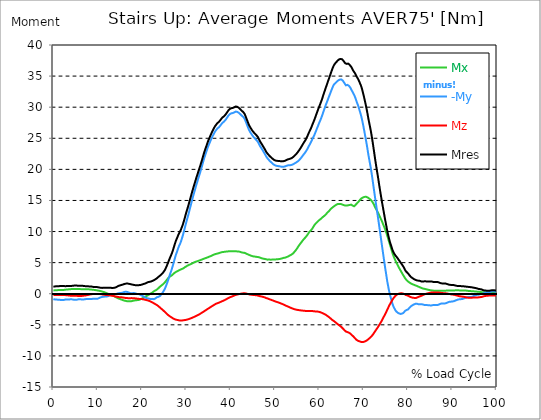
| Category |  Mx |  -My |  Mz |  Mres |
|---|---|---|---|---|
| 0.0 | 0.534 | -0.867 | -0.219 | 1.124 |
| 0.16678370786516855 | 0.534 | -0.886 | -0.219 | 1.153 |
| 0.3335674157303371 | 0.543 | -0.915 | -0.21 | 1.172 |
| 0.5003511235955057 | 0.553 | -0.924 | -0.2 | 1.191 |
| 0.6671348314606742 | 0.562 | -0.943 | -0.2 | 1.2 |
| 0.8339185393258427 | 0.572 | -0.953 | -0.2 | 1.21 |
| 1.0007022471910114 | 0.581 | -0.953 | -0.2 | 1.21 |
| 1.1674859550561796 | 0.591 | -0.953 | -0.21 | 1.22 |
| 1.3342696629213484 | 0.591 | -0.972 | -0.21 | 1.22 |
| 1.5010533707865168 | 0.591 | -0.991 | -0.219 | 1.239 |
| 1.6678370786516854 | 0.591 | -1 | -0.219 | 1.248 |
| 1.8346207865168538 | 0.591 | -1.019 | -0.219 | 1.258 |
| 2.001404494382023 | 0.6 | -1.019 | -0.21 | 1.258 |
| 2.1681882022471908 | 0.6 | -1.019 | -0.2 | 1.258 |
| 2.334971910112359 | 0.61 | -1.01 | -0.2 | 1.248 |
| 2.501755617977528 | 0.629 | -0.981 | -0.21 | 1.229 |
| 2.668539325842697 | 0.648 | -0.943 | -0.219 | 1.21 |
| 2.8353230337078656 | 0.657 | -0.924 | -0.238 | 1.21 |
| 3.0021067415730336 | 0.676 | -0.943 | -0.248 | 1.229 |
| 3.168890449438202 | 0.686 | -0.953 | -0.257 | 1.248 |
| 3.335674157303371 | 0.696 | -0.943 | -0.267 | 1.248 |
| 3.502457865168539 | 0.715 | -0.924 | -0.276 | 1.248 |
| 3.6692415730337076 | 0.724 | -0.915 | -0.295 | 1.248 |
| 3.8360252808988764 | 0.734 | -0.896 | -0.314 | 1.239 |
| 4.002808988764046 | 0.743 | -0.886 | -0.333 | 1.248 |
| 4.169592696629214 | 0.753 | -0.896 | -0.343 | 1.258 |
| 4.3363764044943816 | 0.753 | -0.924 | -0.343 | 1.277 |
| 4.50316011235955 | 0.762 | -0.953 | -0.343 | 1.296 |
| 4.669943820224718 | 0.762 | -0.972 | -0.343 | 1.305 |
| 4.836727528089888 | 0.753 | -0.981 | -0.343 | 1.315 |
| 5.003511235955056 | 0.762 | -0.981 | -0.333 | 1.315 |
| 5.170294943820225 | 0.772 | -0.972 | -0.333 | 1.315 |
| 5.337078651685394 | 0.772 | -0.953 | -0.343 | 1.305 |
| 5.5038623595505625 | 0.772 | -0.924 | -0.353 | 1.286 |
| 5.670646067415731 | 0.762 | -0.896 | -0.362 | 1.277 |
| 5.837429775280899 | 0.753 | -0.886 | -0.372 | 1.267 |
| 6.004213483146067 | 0.743 | -0.886 | -0.372 | 1.267 |
| 6.170997191011236 | 0.743 | -0.905 | -0.372 | 1.277 |
| 6.329002808988764 | 0.734 | -0.915 | -0.362 | 1.277 |
| 6.495786516853932 | 0.734 | -0.924 | -0.353 | 1.277 |
| 6.662570224719101 | 0.734 | -0.924 | -0.333 | 1.267 |
| 6.82935393258427 | 0.724 | -0.915 | -0.314 | 1.258 |
| 6.9961376404494375 | 0.724 | -0.905 | -0.295 | 1.239 |
| 7.162921348314607 | 0.724 | -0.877 | -0.276 | 1.22 |
| 7.329705056179775 | 0.734 | -0.857 | -0.267 | 1.2 |
| 7.496488764044945 | 0.734 | -0.848 | -0.248 | 1.2 |
| 7.663272471910113 | 0.734 | -0.857 | -0.219 | 1.2 |
| 7.830056179775281 | 0.724 | -0.857 | -0.2 | 1.191 |
| 7.996839887640449 | 0.705 | -0.857 | -0.171 | 1.181 |
| 8.16362359550562 | 0.696 | -0.857 | -0.133 | 1.162 |
| 8.330407303370787 | 0.686 | -0.867 | -0.105 | 1.153 |
| 8.497191011235955 | 0.676 | -0.867 | -0.086 | 1.153 |
| 8.663974719101123 | 0.657 | -0.857 | -0.067 | 1.143 |
| 8.830758426966291 | 0.648 | -0.81 | -0.067 | 1.124 |
| 8.99754213483146 | 0.629 | -0.791 | -0.057 | 1.096 |
| 9.16432584269663 | 0.619 | -0.781 | -0.057 | 1.086 |
| 9.331109550561798 | 0.61 | -0.791 | -0.057 | 1.086 |
| 9.497893258426966 | 0.591 | -0.81 | -0.057 | 1.086 |
| 9.664676966292134 | 0.562 | -0.81 | -0.048 | 1.077 |
| 9.831460674157304 | 0.543 | -0.81 | -0.048 | 1.077 |
| 9.998244382022472 | 0.524 | -0.8 | -0.038 | 1.058 |
| 10.16502808988764 | 0.495 | -0.743 | -0.038 | 1.029 |
| 10.331811797752808 | 0.476 | -0.686 | -0.048 | 1 |
| 10.498595505617978 | 0.448 | -0.629 | -0.057 | 0.981 |
| 10.665379213483147 | 0.419 | -0.581 | -0.067 | 0.962 |
| 10.832162921348315 | 0.381 | -0.543 | -0.086 | 0.943 |
| 10.998946629213483 | 0.353 | -0.514 | -0.105 | 0.934 |
| 11.165730337078653 | 0.314 | -0.486 | -0.124 | 0.953 |
| 11.33251404494382 | 0.276 | -0.476 | -0.143 | 0.972 |
| 11.49929775280899 | 0.229 | -0.467 | -0.162 | 0.981 |
| 11.666081460674157 | 0.2 | -0.457 | -0.181 | 0.962 |
| 11.832865168539326 | 0.143 | -0.457 | -0.191 | 0.962 |
| 11.999648876404493 | 0.095 | -0.448 | -0.21 | 0.972 |
| 12.166432584269662 | 0.038 | -0.429 | -0.219 | 0.972 |
| 12.333216292134832 | -0.01 | -0.391 | -0.229 | 0.962 |
| 12.5 | -0.048 | -0.333 | -0.238 | 0.953 |
| 12.66678370786517 | -0.095 | -0.276 | -0.248 | 0.962 |
| 12.833567415730336 | -0.133 | -0.21 | -0.267 | 0.972 |
| 13.000351123595506 | -0.181 | -0.162 | -0.295 | 0.943 |
| 13.167134831460674 | -0.21 | -0.133 | -0.314 | 0.924 |
| 13.333918539325843 | -0.267 | -0.105 | -0.333 | 0.934 |
| 13.500702247191011 | -0.324 | -0.095 | -0.353 | 0.934 |
| 13.667485955056181 | -0.391 | -0.067 | -0.381 | 0.943 |
| 13.834269662921349 | -0.457 | -0.048 | -0.41 | 0.953 |
| 14.001053370786519 | -0.514 | -0.048 | -0.438 | 1 |
| 14.167837078651687 | -0.581 | -0.029 | -0.457 | 1.058 |
| 14.334620786516853 | -0.638 | -0.01 | -0.486 | 1.115 |
| 14.501404494382026 | -0.696 | 0.029 | -0.505 | 1.181 |
| 14.668188202247192 | -0.753 | 0.086 | -0.534 | 1.258 |
| 14.834971910112362 | -0.791 | 0.105 | -0.553 | 1.296 |
| 15.001755617977528 | -0.838 | 0.105 | -0.562 | 1.334 |
| 15.168539325842698 | -0.877 | 0.114 | -0.572 | 1.362 |
| 15.335323033707864 | -0.934 | 0.124 | -0.572 | 1.401 |
| 15.502106741573034 | -0.981 | 0.152 | -0.581 | 1.439 |
| 15.6688904494382 | -1.019 | 0.191 | -0.6 | 1.477 |
| 15.83567415730337 | -1.067 | 0.248 | -0.629 | 1.524 |
| 16.00245786516854 | -1.105 | 0.286 | -0.648 | 1.562 |
| 16.16924157303371 | -1.134 | 0.314 | -0.667 | 1.601 |
| 16.336025280898877 | -1.153 | 0.314 | -0.686 | 1.62 |
| 16.502808988764045 | -1.191 | 0.314 | -0.696 | 1.648 |
| 16.669592696629216 | -1.21 | 0.286 | -0.705 | 1.648 |
| 16.83637640449438 | -1.22 | 0.238 | -0.715 | 1.629 |
| 17.003160112359552 | -1.22 | 0.191 | -0.715 | 1.601 |
| 17.169943820224717 | -1.22 | 0.143 | -0.715 | 1.572 |
| 17.336727528089888 | -1.229 | 0.105 | -0.715 | 1.553 |
| 17.503511235955056 | -1.22 | 0.105 | -0.715 | 1.534 |
| 17.670294943820224 | -1.191 | 0.067 | -0.705 | 1.496 |
| 17.837078651685395 | -1.162 | 0.086 | -0.705 | 1.467 |
| 18.003862359550563 | -1.124 | 0.105 | -0.715 | 1.439 |
| 18.17064606741573 | -1.105 | 0.114 | -0.724 | 1.41 |
| 18.3374297752809 | -1.086 | 0.095 | -0.734 | 1.391 |
| 18.504213483146067 | -1.058 | 0.057 | -0.753 | 1.362 |
| 18.662219101123597 | -1.048 | 0.01 | -0.772 | 1.362 |
| 18.829002808988765 | -1.038 | -0.019 | -0.791 | 1.362 |
| 18.995786516853933 | -1.019 | -0.048 | -0.8 | 1.362 |
| 19.1625702247191 | -1.019 | -0.038 | -0.819 | 1.381 |
| 19.32935393258427 | -0.991 | -0.057 | -0.829 | 1.381 |
| 19.49613764044944 | -0.934 | -0.124 | -0.829 | 1.381 |
| 19.662921348314608 | -0.886 | -0.2 | -0.838 | 1.41 |
| 19.829705056179776 | -0.829 | -0.238 | -0.857 | 1.439 |
| 19.996488764044944 | -0.772 | -0.305 | -0.867 | 1.477 |
| 20.163272471910112 | -0.715 | -0.372 | -0.886 | 1.524 |
| 20.33005617977528 | -0.648 | -0.438 | -0.905 | 1.562 |
| 20.49683988764045 | -0.572 | -0.514 | -0.934 | 1.591 |
| 20.663623595505616 | -0.486 | -0.6 | -0.962 | 1.629 |
| 20.830407303370787 | -0.41 | -0.638 | -0.991 | 1.677 |
| 20.997191011235955 | -0.362 | -0.686 | -1.019 | 1.744 |
| 21.163974719101123 | -0.305 | -0.724 | -1.048 | 1.801 |
| 21.330758426966295 | -0.248 | -0.762 | -1.086 | 1.858 |
| 21.497542134831463 | -0.171 | -0.791 | -1.124 | 1.886 |
| 21.66432584269663 | -0.105 | -0.8 | -1.172 | 1.905 |
| 21.8311095505618 | -0.038 | -0.81 | -1.22 | 1.925 |
| 21.997893258426966 | 0.057 | -0.857 | -1.277 | 1.963 |
| 22.164676966292134 | 0.124 | -0.838 | -1.334 | 2.001 |
| 22.331460674157306 | 0.191 | -0.829 | -1.401 | 2.058 |
| 22.498244382022467 | 0.295 | -0.857 | -1.458 | 2.125 |
| 22.66502808988764 | 0.391 | -0.877 | -1.534 | 2.182 |
| 22.831811797752806 | 0.457 | -0.838 | -1.61 | 2.239 |
| 22.99859550561798 | 0.524 | -0.762 | -1.677 | 2.306 |
| 23.165379213483146 | 0.581 | -0.667 | -1.744 | 2.372 |
| 23.332162921348313 | 0.657 | -0.572 | -1.81 | 2.477 |
| 23.49894662921348 | 0.753 | -0.524 | -1.896 | 2.582 |
| 23.665730337078653 | 0.867 | -0.514 | -1.991 | 2.687 |
| 23.83251404494382 | 0.991 | -0.486 | -2.087 | 2.792 |
| 23.999297752808985 | 1.105 | -0.391 | -2.191 | 2.877 |
| 24.166081460674157 | 1.2 | -0.267 | -2.296 | 2.973 |
| 24.332865168539325 | 1.296 | -0.133 | -2.401 | 3.077 |
| 24.499648876404496 | 1.381 | 0.019 | -2.496 | 3.192 |
| 24.666432584269664 | 1.486 | 0.191 | -2.601 | 3.325 |
| 24.833216292134832 | 1.591 | 0.391 | -2.715 | 3.478 |
| 25.0 | 1.705 | 0.591 | -2.82 | 3.639 |
| 25.16678370786517 | 1.829 | 0.829 | -2.934 | 3.83 |
| 25.33356741573034 | 1.982 | 1.105 | -3.049 | 4.078 |
| 25.500351123595504 | 2.144 | 1.41 | -3.163 | 4.335 |
| 25.66713483146067 | 2.306 | 1.734 | -3.287 | 4.621 |
| 25.833918539325843 | 2.439 | 2.058 | -3.382 | 4.907 |
| 26.00070224719101 | 2.591 | 2.439 | -3.487 | 5.24 |
| 26.16748595505618 | 2.715 | 2.792 | -3.573 | 5.535 |
| 26.334269662921347 | 2.792 | 3.163 | -3.659 | 5.821 |
| 26.50105337078652 | 2.849 | 3.506 | -3.735 | 6.088 |
| 26.667837078651687 | 2.925 | 3.849 | -3.811 | 6.374 |
| 26.834620786516858 | 3.03 | 4.24 | -3.887 | 6.698 |
| 27.001404494382022 | 3.135 | 4.649 | -3.963 | 7.05 |
| 27.16818820224719 | 3.249 | 5.078 | -4.04 | 7.45 |
| 27.334971910112362 | 3.354 | 5.507 | -4.097 | 7.832 |
| 27.50175561797753 | 3.43 | 5.926 | -4.144 | 8.203 |
| 27.668539325842698 | 3.506 | 6.307 | -4.173 | 8.546 |
| 27.835323033707866 | 3.573 | 6.641 | -4.202 | 8.841 |
| 28.002106741573037 | 3.63 | 6.974 | -4.221 | 9.118 |
| 28.168890449438205 | 3.697 | 7.327 | -4.249 | 9.423 |
| 28.335674157303373 | 3.763 | 7.641 | -4.278 | 9.689 |
| 28.502457865168537 | 3.811 | 7.898 | -4.297 | 9.899 |
| 28.669241573033705 | 3.878 | 8.165 | -4.316 | 10.128 |
| 28.836025280898877 | 3.935 | 8.498 | -4.325 | 10.413 |
| 29.002808988764052 | 3.982 | 8.889 | -4.306 | 10.728 |
| 29.169592696629213 | 4.021 | 9.27 | -4.287 | 11.033 |
| 29.336376404494384 | 4.087 | 9.708 | -4.259 | 11.423 |
| 29.50316011235955 | 4.163 | 10.156 | -4.24 | 11.824 |
| 29.669943820224724 | 4.259 | 10.614 | -4.24 | 12.252 |
| 29.836727528089884 | 4.345 | 11.08 | -4.211 | 12.691 |
| 30.003511235955056 | 4.411 | 11.538 | -4.192 | 13.11 |
| 30.170294943820224 | 4.478 | 11.976 | -4.173 | 13.51 |
| 30.337078651685395 | 4.545 | 12.395 | -4.125 | 13.891 |
| 30.503862359550563 | 4.611 | 12.843 | -4.087 | 14.31 |
| 30.670646067415728 | 4.659 | 13.31 | -4.049 | 14.729 |
| 30.837429775280903 | 4.707 | 13.777 | -4.002 | 15.158 |
| 30.99543539325843 | 4.764 | 14.234 | -3.954 | 15.587 |
| 31.162219101123597 | 4.83 | 14.701 | -3.916 | 16.025 |
| 31.32900280898876 | 4.888 | 15.158 | -3.868 | 16.454 |
| 31.495786516853936 | 4.945 | 15.615 | -3.82 | 16.864 |
| 31.6625702247191 | 5.011 | 16.035 | -3.754 | 17.264 |
| 31.82935393258427 | 5.078 | 16.444 | -3.697 | 17.654 |
| 31.996137640449433 | 5.126 | 16.864 | -3.649 | 18.045 |
| 32.162921348314605 | 5.164 | 17.292 | -3.582 | 18.445 |
| 32.329705056179776 | 5.192 | 17.692 | -3.525 | 18.817 |
| 32.49648876404494 | 5.221 | 18.074 | -3.468 | 19.16 |
| 32.66327247191011 | 5.269 | 18.502 | -3.401 | 19.56 |
| 32.83005617977528 | 5.326 | 18.864 | -3.354 | 19.912 |
| 32.996839887640455 | 5.364 | 19.236 | -3.287 | 20.274 |
| 33.16362359550562 | 5.402 | 19.626 | -3.211 | 20.646 |
| 33.330407303370784 | 5.45 | 20.046 | -3.125 | 21.046 |
| 33.497191011235955 | 5.497 | 20.446 | -3.049 | 21.427 |
| 33.66397471910113 | 5.545 | 20.875 | -2.982 | 21.837 |
| 33.83075842696629 | 5.593 | 21.322 | -2.906 | 22.266 |
| 33.997542134831455 | 5.64 | 21.732 | -2.83 | 22.656 |
| 34.164325842696634 | 5.688 | 22.104 | -2.753 | 23.018 |
| 34.3311095505618 | 5.726 | 22.466 | -2.677 | 23.371 |
| 34.49789325842697 | 5.774 | 22.809 | -2.591 | 23.704 |
| 34.66467696629213 | 5.812 | 23.171 | -2.515 | 24.057 |
| 34.831460674157306 | 5.859 | 23.523 | -2.439 | 24.4 |
| 34.99824438202247 | 5.907 | 23.838 | -2.363 | 24.714 |
| 35.16502808988764 | 5.964 | 24.114 | -2.287 | 24.981 |
| 35.331811797752806 | 6.012 | 24.4 | -2.21 | 25.267 |
| 35.49859550561798 | 6.05 | 24.686 | -2.134 | 25.543 |
| 35.66537921348315 | 6.098 | 24.943 | -2.058 | 25.81 |
| 35.83216292134831 | 6.164 | 25.21 | -1.982 | 26.067 |
| 35.998946629213485 | 6.221 | 25.448 | -1.905 | 26.305 |
| 36.16573033707865 | 6.279 | 25.667 | -1.839 | 26.534 |
| 36.33251404494382 | 6.326 | 25.905 | -1.763 | 26.772 |
| 36.499297752808985 | 6.364 | 26.105 | -1.696 | 26.963 |
| 36.666081460674164 | 6.402 | 26.267 | -1.62 | 27.125 |
| 36.83286516853932 | 6.431 | 26.42 | -1.562 | 27.277 |
| 36.99964887640449 | 6.46 | 26.572 | -1.524 | 27.439 |
| 37.166432584269664 | 6.488 | 26.667 | -1.486 | 27.534 |
| 37.333216292134836 | 6.517 | 26.753 | -1.448 | 27.62 |
| 37.5 | 6.564 | 26.858 | -1.401 | 27.734 |
| 37.666783707865164 | 6.612 | 27.039 | -1.334 | 27.915 |
| 37.833567415730336 | 6.65 | 27.201 | -1.277 | 28.077 |
| 38.00035112359551 | 6.679 | 27.315 | -1.229 | 28.182 |
| 38.16713483146068 | 6.698 | 27.496 | -1.172 | 28.363 |
| 38.333918539325836 | 6.717 | 27.591 | -1.124 | 28.458 |
| 38.50070224719101 | 6.736 | 27.677 | -1.077 | 28.535 |
| 38.66748595505618 | 6.745 | 27.782 | -1.019 | 28.639 |
| 38.83426966292135 | 6.764 | 27.953 | -0.953 | 28.811 |
| 39.001053370786515 | 6.784 | 28.115 | -0.886 | 28.973 |
| 39.16783707865169 | 6.793 | 28.306 | -0.819 | 29.154 |
| 39.33462078651686 | 6.803 | 28.468 | -0.753 | 29.316 |
| 39.50140449438202 | 6.822 | 28.658 | -0.696 | 29.497 |
| 39.668188202247194 | 6.831 | 28.792 | -0.629 | 29.621 |
| 39.83497191011236 | 6.831 | 28.897 | -0.572 | 29.726 |
| 40.00175561797753 | 6.841 | 28.963 | -0.524 | 29.792 |
| 40.168539325842694 | 6.85 | 29.011 | -0.476 | 29.84 |
| 40.335323033707866 | 6.841 | 29.03 | -0.438 | 29.859 |
| 40.50210674157304 | 6.841 | 29.068 | -0.391 | 29.887 |
| 40.6688904494382 | 6.841 | 29.125 | -0.333 | 29.945 |
| 40.83567415730337 | 6.831 | 29.173 | -0.286 | 29.992 |
| 41.00245786516854 | 6.831 | 29.249 | -0.229 | 30.059 |
| 41.16924157303371 | 6.822 | 29.297 | -0.181 | 30.116 |
| 41.33602528089887 | 6.812 | 29.278 | -0.152 | 30.097 |
| 41.502808988764045 | 6.803 | 29.24 | -0.124 | 30.049 |
| 41.669592696629216 | 6.793 | 29.173 | -0.095 | 29.983 |
| 41.83637640449439 | 6.774 | 29.097 | -0.076 | 29.907 |
| 42.00316011235955 | 6.764 | 29.021 | -0.048 | 29.83 |
| 42.16994382022472 | 6.717 | 28.878 | -0.019 | 29.678 |
| 42.33672752808989 | 6.679 | 28.763 | 0.01 | 29.554 |
| 42.50351123595506 | 6.65 | 28.639 | 0.029 | 29.43 |
| 42.670294943820224 | 6.612 | 28.525 | 0.048 | 29.306 |
| 42.83707865168539 | 6.612 | 28.439 | 0.067 | 29.221 |
| 43.00386235955057 | 6.602 | 28.325 | 0.076 | 29.116 |
| 43.17064606741573 | 6.574 | 28.106 | 0.067 | 28.887 |
| 43.32865168539326 | 6.517 | 27.82 | 0.057 | 28.601 |
| 43.495435393258425 | 6.46 | 27.515 | 0.029 | 28.287 |
| 43.6622191011236 | 6.402 | 27.201 | 0 | 27.982 |
| 43.82900280898876 | 6.345 | 26.886 | -0.029 | 27.668 |
| 43.99578651685393 | 6.288 | 26.581 | -0.067 | 27.363 |
| 44.162570224719104 | 6.24 | 26.296 | -0.105 | 27.077 |
| 44.32935393258427 | 6.193 | 26.086 | -0.133 | 26.867 |
| 44.49613764044944 | 6.145 | 25.876 | -0.152 | 26.648 |
| 44.66292134831461 | 6.098 | 25.705 | -0.162 | 26.477 |
| 44.82970505617978 | 6.05 | 25.524 | -0.181 | 26.286 |
| 44.99648876404493 | 6.021 | 25.362 | -0.191 | 26.124 |
| 45.16327247191011 | 6.002 | 25.2 | -0.2 | 25.972 |
| 45.33005617977528 | 5.983 | 25.067 | -0.21 | 25.838 |
| 45.49683988764045 | 5.964 | 24.943 | -0.219 | 25.714 |
| 45.66362359550561 | 5.955 | 24.828 | -0.238 | 25.591 |
| 45.83040730337079 | 5.936 | 24.695 | -0.257 | 25.457 |
| 45.99719101123596 | 5.907 | 24.562 | -0.267 | 25.333 |
| 46.16397471910113 | 5.907 | 24.4 | -0.295 | 25.171 |
| 46.33075842696629 | 5.878 | 24.162 | -0.343 | 24.933 |
| 46.497542134831455 | 5.821 | 23.923 | -0.372 | 24.686 |
| 46.66432584269663 | 5.793 | 23.685 | -0.41 | 24.457 |
| 46.83110955056179 | 5.745 | 23.514 | -0.429 | 24.266 |
| 46.99789325842696 | 5.697 | 23.323 | -0.448 | 24.076 |
| 47.164676966292134 | 5.659 | 23.142 | -0.476 | 23.885 |
| 47.331460674157306 | 5.64 | 22.932 | -0.514 | 23.685 |
| 47.49824438202247 | 5.621 | 22.723 | -0.553 | 23.476 |
| 47.66502808988764 | 5.593 | 22.532 | -0.591 | 23.285 |
| 47.83181179775281 | 5.574 | 22.323 | -0.638 | 23.075 |
| 47.99859550561797 | 5.545 | 22.085 | -0.696 | 22.837 |
| 48.16537921348314 | 5.507 | 21.904 | -0.734 | 22.666 |
| 48.33216292134831 | 5.478 | 21.77 | -0.762 | 22.523 |
| 48.498946629213485 | 5.488 | 21.608 | -0.81 | 22.37 |
| 48.66573033707865 | 5.507 | 21.465 | -0.867 | 22.237 |
| 48.83251404494382 | 5.497 | 21.341 | -0.905 | 22.113 |
| 48.99929775280899 | 5.478 | 21.218 | -0.943 | 21.989 |
| 49.166081460674164 | 5.478 | 21.122 | -0.991 | 21.894 |
| 49.33286516853933 | 5.488 | 20.998 | -1.038 | 21.78 |
| 49.499648876404486 | 5.488 | 20.894 | -1.086 | 21.684 |
| 49.666432584269664 | 5.488 | 20.798 | -1.124 | 21.589 |
| 49.83321629213483 | 5.478 | 20.713 | -1.172 | 21.503 |
| 50.0 | 5.497 | 20.636 | -1.22 | 21.437 |
| 50.166783707865164 | 5.516 | 20.608 | -1.258 | 21.408 |
| 50.33356741573034 | 5.535 | 20.579 | -1.305 | 21.389 |
| 50.50035112359551 | 5.554 | 20.551 | -1.343 | 21.37 |
| 50.66713483146068 | 5.554 | 20.532 | -1.381 | 21.36 |
| 50.83391853932584 | 5.574 | 20.513 | -1.42 | 21.341 |
| 51.00070224719101 | 5.583 | 20.493 | -1.467 | 21.322 |
| 51.16748595505618 | 5.602 | 20.474 | -1.515 | 21.322 |
| 51.33426966292134 | 5.631 | 20.455 | -1.562 | 21.313 |
| 51.50105337078652 | 5.659 | 20.417 | -1.61 | 21.284 |
| 51.66783707865169 | 5.697 | 20.389 | -1.658 | 21.275 |
| 51.83462078651686 | 5.736 | 20.408 | -1.715 | 21.303 |
| 52.00140449438202 | 5.774 | 20.436 | -1.763 | 21.341 |
| 52.168188202247194 | 5.793 | 20.455 | -1.829 | 21.36 |
| 52.33497191011236 | 5.812 | 20.484 | -1.886 | 21.399 |
| 52.50175561797752 | 5.859 | 20.541 | -1.934 | 21.465 |
| 52.668539325842694 | 5.907 | 20.598 | -1.982 | 21.541 |
| 52.835323033707866 | 5.955 | 20.636 | -2.029 | 21.599 |
| 53.00210674157304 | 6.012 | 20.646 | -2.087 | 21.627 |
| 53.1688904494382 | 6.069 | 20.655 | -2.144 | 21.656 |
| 53.33567415730337 | 6.145 | 20.636 | -2.201 | 21.675 |
| 53.502457865168545 | 6.202 | 20.674 | -2.248 | 21.732 |
| 53.669241573033716 | 6.269 | 20.703 | -2.296 | 21.78 |
| 53.83602528089887 | 6.336 | 20.741 | -2.344 | 21.846 |
| 54.002808988764045 | 6.431 | 20.779 | -2.391 | 21.923 |
| 54.169592696629216 | 6.536 | 20.846 | -2.439 | 22.018 |
| 54.33637640449438 | 6.688 | 20.922 | -2.477 | 22.142 |
| 54.50316011235955 | 6.822 | 20.989 | -2.515 | 22.266 |
| 54.669943820224724 | 6.974 | 21.065 | -2.544 | 22.38 |
| 54.836727528089895 | 7.136 | 21.132 | -2.572 | 22.504 |
| 55.00351123595506 | 7.308 | 21.198 | -2.591 | 22.637 |
| 55.17029494382022 | 7.498 | 21.303 | -2.611 | 22.799 |
| 55.337078651685395 | 7.689 | 21.408 | -2.63 | 22.971 |
| 55.50386235955056 | 7.841 | 21.522 | -2.649 | 23.133 |
| 55.66186797752809 | 8.013 | 21.646 | -2.668 | 23.314 |
| 55.82865168539326 | 8.165 | 21.799 | -2.687 | 23.504 |
| 55.995435393258425 | 8.317 | 21.961 | -2.696 | 23.704 |
| 56.1622191011236 | 8.479 | 22.113 | -2.715 | 23.904 |
| 56.32900280898877 | 8.632 | 22.275 | -2.725 | 24.104 |
| 56.49578651685393 | 8.775 | 22.428 | -2.734 | 24.304 |
| 56.6625702247191 | 8.908 | 22.58 | -2.744 | 24.485 |
| 56.82935393258427 | 9.032 | 22.732 | -2.763 | 24.666 |
| 56.99613764044943 | 9.156 | 22.913 | -2.782 | 24.886 |
| 57.16292134831461 | 9.318 | 23.104 | -2.792 | 25.124 |
| 57.329705056179776 | 9.499 | 23.323 | -2.792 | 25.381 |
| 57.49648876404495 | 9.661 | 23.552 | -2.792 | 25.657 |
| 57.66327247191011 | 9.87 | 23.78 | -2.792 | 25.943 |
| 57.83005617977529 | 10.004 | 23.99 | -2.782 | 26.181 |
| 57.99683988764044 | 10.109 | 24.219 | -2.763 | 26.429 |
| 58.16362359550561 | 10.232 | 24.457 | -2.763 | 26.696 |
| 58.33040730337079 | 10.394 | 24.714 | -2.772 | 26.991 |
| 58.497191011235955 | 10.566 | 24.981 | -2.782 | 27.306 |
| 58.66397471910112 | 10.776 | 25.2 | -2.811 | 27.582 |
| 58.83075842696629 | 10.976 | 25.438 | -2.839 | 27.877 |
| 58.99754213483147 | 11.118 | 25.734 | -2.839 | 28.201 |
| 59.164325842696634 | 11.271 | 26.029 | -2.839 | 28.535 |
| 59.33110955056179 | 11.395 | 26.334 | -2.839 | 28.868 |
| 59.49789325842697 | 11.519 | 26.639 | -2.849 | 29.192 |
| 59.664676966292134 | 11.642 | 26.924 | -2.877 | 29.516 |
| 59.8314606741573 | 11.747 | 27.229 | -2.906 | 29.84 |
| 59.99824438202247 | 11.833 | 27.525 | -2.925 | 30.135 |
| 60.16502808988765 | 11.938 | 27.801 | -2.963 | 30.44 |
| 60.33181179775281 | 12.052 | 28.096 | -3.001 | 30.754 |
| 60.49859550561798 | 12.147 | 28.392 | -3.049 | 31.069 |
| 60.66537921348315 | 12.243 | 28.725 | -3.106 | 31.421 |
| 60.83216292134831 | 12.357 | 29.087 | -3.163 | 31.803 |
| 60.99894662921348 | 12.462 | 29.44 | -3.22 | 32.165 |
| 61.16573033707864 | 12.548 | 29.764 | -3.268 | 32.508 |
| 61.33251404494383 | 12.662 | 30.097 | -3.335 | 32.86 |
| 61.49929775280899 | 12.776 | 30.44 | -3.411 | 33.222 |
| 61.66608146067416 | 12.919 | 30.735 | -3.497 | 33.556 |
| 61.83286516853932 | 13.062 | 31.04 | -3.582 | 33.899 |
| 61.99964887640451 | 13.176 | 31.374 | -3.668 | 34.251 |
| 62.16643258426967 | 13.272 | 31.688 | -3.744 | 34.585 |
| 62.33321629213482 | 13.415 | 31.984 | -3.849 | 34.927 |
| 62.5 | 13.567 | 32.288 | -3.954 | 35.27 |
| 62.66678370786517 | 13.681 | 32.612 | -4.059 | 35.623 |
| 62.833567415730336 | 13.796 | 32.908 | -4.163 | 35.947 |
| 63.0003511235955 | 13.891 | 33.213 | -4.259 | 36.28 |
| 63.16713483146068 | 13.977 | 33.47 | -4.335 | 36.557 |
| 63.33391853932585 | 14.062 | 33.679 | -4.421 | 36.795 |
| 63.500702247191015 | 14.158 | 33.813 | -4.516 | 36.966 |
| 63.66748595505618 | 14.243 | 33.889 | -4.611 | 37.081 |
| 63.83426966292135 | 14.31 | 34.032 | -4.716 | 37.252 |
| 64.00105337078651 | 14.377 | 34.146 | -4.811 | 37.395 |
| 64.16783707865169 | 14.425 | 34.242 | -4.897 | 37.509 |
| 64.33462078651687 | 14.444 | 34.337 | -4.992 | 37.624 |
| 64.50140449438203 | 14.444 | 34.423 | -5.078 | 37.71 |
| 64.6681882022472 | 14.444 | 34.442 | -5.173 | 37.748 |
| 64.83497191011236 | 14.425 | 34.442 | -5.278 | 37.757 |
| 65.00175561797754 | 14.405 | 34.451 | -5.364 | 37.767 |
| 65.16853932584269 | 14.348 | 34.375 | -5.478 | 37.69 |
| 65.33532303370787 | 14.291 | 34.242 | -5.602 | 37.567 |
| 65.50210674157304 | 14.253 | 34.051 | -5.736 | 37.405 |
| 65.66889044943821 | 14.196 | 33.87 | -5.859 | 37.233 |
| 65.83567415730337 | 14.177 | 33.679 | -5.974 | 37.071 |
| 66.00245786516854 | 14.158 | 33.508 | -6.078 | 36.928 |
| 66.1692415730337 | 14.177 | 33.536 | -6.126 | 36.966 |
| 66.33602528089888 | 14.205 | 33.584 | -6.164 | 37.024 |
| 66.50280898876404 | 14.224 | 33.546 | -6.212 | 37.014 |
| 66.66959269662921 | 14.253 | 33.441 | -6.269 | 36.928 |
| 66.83637640449439 | 14.272 | 33.298 | -6.326 | 36.814 |
| 67.00316011235955 | 14.272 | 33.127 | -6.412 | 36.671 |
| 67.16994382022472 | 14.329 | 32.898 | -6.526 | 36.509 |
| 67.33672752808988 | 14.348 | 32.67 | -6.65 | 36.338 |
| 67.50351123595506 | 14.177 | 32.45 | -6.736 | 36.08 |
| 67.67029494382022 | 14.082 | 32.231 | -6.86 | 35.861 |
| 67.83707865168539 | 14.062 | 32.003 | -6.993 | 35.68 |
| 67.99508426966291 | 14.158 | 31.745 | -7.127 | 35.509 |
| 68.16186797752809 | 14.282 | 31.412 | -7.269 | 35.299 |
| 68.32865168539327 | 14.415 | 31.059 | -7.384 | 35.061 |
| 68.49543539325843 | 14.539 | 30.716 | -7.469 | 34.832 |
| 68.6622191011236 | 14.653 | 30.421 | -7.546 | 34.632 |
| 68.82900280898876 | 14.796 | 30.078 | -7.593 | 34.403 |
| 68.99578651685394 | 14.949 | 29.678 | -7.641 | 34.137 |
| 69.1625702247191 | 15.091 | 29.287 | -7.679 | 33.86 |
| 69.32935393258425 | 15.215 | 28.878 | -7.727 | 33.575 |
| 69.49613764044945 | 15.33 | 28.43 | -7.765 | 33.251 |
| 69.66292134831461 | 15.415 | 27.896 | -7.774 | 32.841 |
| 69.82970505617978 | 15.473 | 27.315 | -7.765 | 32.374 |
| 69.99648876404494 | 15.53 | 26.715 | -7.746 | 31.898 |
| 70.16327247191012 | 15.568 | 26.086 | -7.717 | 31.374 |
| 70.33005617977528 | 15.596 | 25.429 | -7.66 | 30.84 |
| 70.49683988764045 | 15.596 | 24.79 | -7.603 | 30.297 |
| 70.66362359550561 | 15.568 | 24.114 | -7.536 | 29.716 |
| 70.83040730337079 | 15.511 | 23.399 | -7.45 | 29.087 |
| 70.99719101123596 | 15.425 | 22.656 | -7.346 | 28.42 |
| 71.16397471910112 | 15.349 | 21.951 | -7.241 | 27.782 |
| 71.3307584269663 | 15.263 | 21.303 | -7.146 | 27.201 |
| 71.49754213483146 | 15.168 | 20.665 | -7.041 | 26.629 |
| 71.66432584269663 | 15.063 | 19.96 | -6.926 | 25.991 |
| 71.83110955056179 | 14.91 | 19.198 | -6.793 | 25.286 |
| 71.99789325842697 | 14.739 | 18.388 | -6.65 | 24.533 |
| 72.16467696629215 | 14.539 | 17.53 | -6.488 | 23.733 |
| 72.3314606741573 | 14.301 | 16.692 | -6.317 | 22.913 |
| 72.49824438202248 | 14.043 | 15.844 | -6.136 | 22.085 |
| 72.66502808988764 | 13.805 | 15.006 | -5.955 | 21.284 |
| 72.8318117977528 | 13.577 | 14.186 | -5.783 | 20.522 |
| 72.99859550561797 | 13.348 | 13.376 | -5.602 | 19.769 |
| 73.16537921348315 | 13.138 | 12.586 | -5.431 | 19.074 |
| 73.33216292134833 | 12.9 | 11.776 | -5.24 | 18.312 |
| 73.49894662921349 | 12.624 | 10.947 | -5.04 | 17.53 |
| 73.66573033707864 | 12.367 | 10.109 | -4.849 | 16.778 |
| 73.83251404494382 | 12.109 | 9.261 | -4.649 | 16.044 |
| 73.99929775280899 | 11.852 | 8.403 | -4.449 | 15.32 |
| 74.16608146067415 | 11.585 | 7.565 | -4.24 | 14.615 |
| 74.33286516853933 | 11.29 | 6.726 | -3.992 | 13.958 |
| 74.49964887640449 | 10.985 | 5.897 | -3.763 | 13.291 |
| 74.66643258426967 | 10.69 | 5.088 | -3.544 | 12.624 |
| 74.83321629213484 | 10.385 | 4.249 | -3.325 | 11.947 |
| 75.0 | 10.042 | 3.497 | -3.077 | 11.347 |
| 75.16678370786516 | 9.689 | 2.725 | -2.83 | 10.718 |
| 75.33356741573033 | 9.318 | 1.963 | -2.563 | 10.08 |
| 75.5003511235955 | 8.937 | 1.334 | -2.325 | 9.566 |
| 75.66713483146067 | 8.518 | 0.696 | -2.058 | 9.032 |
| 75.83391853932585 | 8.117 | 0.162 | -1.82 | 8.565 |
| 76.00070224719101 | 7.727 | -0.324 | -1.601 | 8.136 |
| 76.16748595505618 | 7.355 | -0.753 | -1.391 | 7.793 |
| 76.33426966292136 | 6.945 | -1.2 | -1.181 | 7.422 |
| 76.50105337078652 | 6.536 | -1.62 | -0.962 | 7.05 |
| 76.66783707865167 | 6.193 | -1.953 | -0.781 | 6.774 |
| 76.83462078651685 | 5.878 | -2.229 | -0.619 | 6.517 |
| 77.00140449438202 | 5.612 | -2.439 | -0.486 | 6.345 |
| 77.1681882022472 | 5.326 | -2.668 | -0.343 | 6.155 |
| 77.33497191011236 | 5.088 | -2.83 | -0.229 | 6.012 |
| 77.50175561797754 | 4.849 | -2.963 | -0.143 | 5.859 |
| 77.6685393258427 | 4.621 | -3.039 | -0.067 | 5.697 |
| 77.83532303370787 | 4.392 | -3.106 | -0.01 | 5.526 |
| 78.00210674157303 | 4.154 | -3.173 | 0.019 | 5.354 |
| 78.1688904494382 | 3.935 | -3.23 | 0.048 | 5.192 |
| 78.33567415730337 | 3.725 | -3.249 | 0.067 | 5.021 |
| 78.50245786516854 | 3.516 | -3.23 | 0.076 | 4.849 |
| 78.66924157303372 | 3.316 | -3.192 | 0.067 | 4.678 |
| 78.83602528089888 | 3.096 | -3.154 | 0.038 | 4.497 |
| 79.00280898876404 | 2.915 | -3.068 | 0.01 | 4.306 |
| 79.16959269662921 | 2.706 | -2.944 | -0.048 | 4.087 |
| 79.33637640449439 | 2.506 | -2.772 | -0.133 | 3.83 |
| 79.50316011235955 | 2.353 | -2.658 | -0.2 | 3.639 |
| 79.66994382022472 | 2.201 | -2.62 | -0.229 | 3.497 |
| 79.8367275280899 | 2.077 | -2.601 | -0.267 | 3.401 |
| 80.00351123595506 | 1.982 | -2.534 | -0.305 | 3.287 |
| 80.17029494382022 | 1.886 | -2.401 | -0.372 | 3.125 |
| 80.32830056179776 | 1.801 | -2.258 | -0.448 | 2.963 |
| 80.49508426966293 | 1.715 | -2.125 | -0.514 | 2.82 |
| 80.66186797752809 | 1.648 | -2.02 | -0.562 | 2.706 |
| 80.82865168539325 | 1.591 | -1.944 | -0.591 | 2.611 |
| 80.99543539325842 | 1.534 | -1.858 | -0.629 | 2.515 |
| 81.1622191011236 | 1.486 | -1.782 | -0.657 | 2.429 |
| 81.32900280898878 | 1.439 | -1.724 | -0.676 | 2.363 |
| 81.49578651685394 | 1.391 | -1.677 | -0.676 | 2.296 |
| 81.6625702247191 | 1.343 | -1.629 | -0.686 | 2.229 |
| 81.82935393258427 | 1.296 | -1.601 | -0.676 | 2.182 |
| 81.99613764044945 | 1.248 | -1.61 | -0.629 | 2.144 |
| 82.16292134831461 | 1.2 | -1.639 | -0.581 | 2.125 |
| 82.32970505617978 | 1.143 | -1.677 | -0.524 | 2.106 |
| 82.49648876404494 | 1.086 | -1.696 | -0.467 | 2.087 |
| 82.66327247191012 | 1.038 | -1.705 | -0.419 | 2.067 |
| 82.83005617977528 | 0.991 | -1.696 | -0.381 | 2.02 |
| 82.99683988764045 | 0.943 | -1.686 | -0.333 | 1.982 |
| 83.16362359550563 | 0.896 | -1.696 | -0.286 | 1.953 |
| 83.33040730337079 | 0.848 | -1.724 | -0.229 | 1.953 |
| 83.49719101123596 | 0.819 | -1.763 | -0.162 | 1.972 |
| 83.66397471910112 | 0.791 | -1.801 | -0.114 | 1.991 |
| 83.8307584269663 | 0.762 | -1.829 | -0.076 | 2.001 |
| 83.99754213483146 | 0.734 | -1.829 | -0.029 | 1.991 |
| 84.16432584269663 | 0.705 | -1.82 | 0.01 | 1.963 |
| 84.33110955056179 | 0.676 | -1.829 | 0.038 | 1.963 |
| 84.49789325842697 | 0.648 | -1.839 | 0.067 | 1.953 |
| 84.66467696629213 | 0.619 | -1.848 | 0.095 | 1.953 |
| 84.8314606741573 | 0.591 | -1.867 | 0.124 | 1.963 |
| 84.99824438202248 | 0.572 | -1.877 | 0.152 | 1.972 |
| 85.16502808988764 | 0.553 | -1.886 | 0.181 | 1.972 |
| 85.3318117977528 | 0.534 | -1.877 | 0.2 | 1.963 |
| 85.49859550561797 | 0.514 | -1.848 | 0.2 | 1.934 |
| 85.66537921348315 | 0.505 | -1.82 | 0.2 | 1.905 |
| 85.83216292134831 | 0.486 | -1.81 | 0.2 | 1.886 |
| 85.99894662921348 | 0.476 | -1.81 | 0.2 | 1.886 |
| 86.16573033707866 | 0.467 | -1.829 | 0.2 | 1.896 |
| 86.33251404494384 | 0.467 | -1.829 | 0.2 | 1.905 |
| 86.499297752809 | 0.476 | -1.839 | 0.21 | 1.915 |
| 86.66608146067415 | 0.476 | -1.82 | 0.21 | 1.896 |
| 86.83286516853933 | 0.467 | -1.772 | 0.2 | 1.848 |
| 86.99964887640449 | 0.467 | -1.724 | 0.191 | 1.801 |
| 87.16643258426966 | 0.467 | -1.677 | 0.171 | 1.753 |
| 87.33321629213482 | 0.476 | -1.62 | 0.152 | 1.705 |
| 87.5 | 0.476 | -1.591 | 0.133 | 1.677 |
| 87.66678370786518 | 0.476 | -1.562 | 0.114 | 1.658 |
| 87.83356741573033 | 0.476 | -1.572 | 0.105 | 1.658 |
| 88.00035112359551 | 0.476 | -1.572 | 0.095 | 1.658 |
| 88.16713483146067 | 0.476 | -1.572 | 0.086 | 1.667 |
| 88.33391853932584 | 0.476 | -1.562 | 0.076 | 1.658 |
| 88.500702247191 | 0.495 | -1.543 | 0.067 | 1.639 |
| 88.66748595505618 | 0.505 | -1.496 | 0.048 | 1.601 |
| 88.83426966292136 | 0.514 | -1.448 | 0.038 | 1.562 |
| 89.00105337078652 | 0.524 | -1.391 | 0.01 | 1.515 |
| 89.16783707865169 | 0.534 | -1.343 | -0.019 | 1.477 |
| 89.33462078651687 | 0.534 | -1.296 | -0.048 | 1.439 |
| 89.50140449438203 | 0.534 | -1.277 | -0.067 | 1.42 |
| 89.6681882022472 | 0.524 | -1.277 | -0.095 | 1.42 |
| 89.83497191011236 | 0.524 | -1.267 | -0.114 | 1.42 |
| 90.00175561797754 | 0.524 | -1.248 | -0.133 | 1.41 |
| 90.16853932584269 | 0.524 | -1.239 | -0.143 | 1.401 |
| 90.33532303370787 | 0.524 | -1.2 | -0.162 | 1.391 |
| 90.50210674157303 | 0.534 | -1.162 | -0.181 | 1.362 |
| 90.6688904494382 | 0.543 | -1.105 | -0.21 | 1.324 |
| 90.83567415730336 | 0.543 | -1.058 | -0.248 | 1.286 |
| 91.00245786516854 | 0.553 | -1.01 | -0.286 | 1.267 |
| 91.1692415730337 | 0.553 | -0.962 | -0.314 | 1.248 |
| 91.33602528089888 | 0.553 | -0.924 | -0.353 | 1.239 |
| 91.50280898876404 | 0.543 | -0.905 | -0.381 | 1.239 |
| 91.66959269662922 | 0.534 | -0.896 | -0.41 | 1.239 |
| 91.83637640449439 | 0.524 | -0.877 | -0.419 | 1.229 |
| 92.00316011235955 | 0.514 | -0.867 | -0.438 | 1.22 |
| 92.16994382022472 | 0.505 | -0.857 | -0.457 | 1.22 |
| 92.3367275280899 | 0.505 | -0.838 | -0.467 | 1.21 |
| 92.50351123595506 | 0.514 | -0.791 | -0.486 | 1.191 |
| 92.66151685393258 | 0.514 | -0.743 | -0.505 | 1.181 |
| 92.82830056179776 | 0.514 | -0.696 | -0.524 | 1.172 |
| 92.99508426966291 | 0.514 | -0.648 | -0.543 | 1.153 |
| 93.16186797752809 | 0.495 | -0.6 | -0.591 | 1.134 |
| 93.32865168539325 | 0.486 | -0.562 | -0.619 | 1.124 |
| 93.49543539325842 | 0.476 | -0.534 | -0.629 | 1.115 |
| 93.66221910112358 | 0.448 | -0.534 | -0.638 | 1.096 |
| 93.82900280898876 | 0.429 | -0.543 | -0.638 | 1.077 |
| 93.99578651685393 | 0.429 | -0.543 | -0.638 | 1.067 |
| 94.1625702247191 | 0.419 | -0.534 | -0.638 | 1.048 |
| 94.32935393258427 | 0.41 | -0.514 | -0.629 | 1.038 |
| 94.49613764044945 | 0.41 | -0.476 | -0.629 | 1.019 |
| 94.66292134831461 | 0.41 | -0.438 | -0.619 | 1 |
| 94.82970505617978 | 0.391 | -0.381 | -0.619 | 0.972 |
| 94.99648876404494 | 0.372 | -0.305 | -0.629 | 0.943 |
| 95.16327247191012 | 0.362 | -0.257 | -0.619 | 0.915 |
| 95.33005617977528 | 0.353 | -0.229 | -0.619 | 0.896 |
| 95.49683988764046 | 0.343 | -0.2 | -0.619 | 0.877 |
| 95.66362359550563 | 0.324 | -0.162 | -0.61 | 0.838 |
| 95.83040730337078 | 0.314 | -0.152 | -0.591 | 0.791 |
| 95.99719101123594 | 0.305 | -0.143 | -0.572 | 0.753 |
| 96.16397471910112 | 0.295 | -0.095 | -0.562 | 0.743 |
| 96.33075842696628 | 0.286 | -0.057 | -0.553 | 0.734 |
| 96.49754213483145 | 0.267 | -0.038 | -0.534 | 0.705 |
| 96.66432584269663 | 0.248 | -0.038 | -0.514 | 0.676 |
| 96.8311095505618 | 0.238 | 0 | -0.486 | 0.619 |
| 96.99789325842697 | 0.229 | 0.057 | -0.429 | 0.562 |
| 97.16467696629213 | 0.229 | 0.095 | -0.4 | 0.534 |
| 97.3314606741573 | 0.229 | 0.133 | -0.372 | 0.524 |
| 97.49824438202248 | 0.219 | 0.143 | -0.353 | 0.505 |
| 97.66502808988764 | 0.21 | 0.171 | -0.333 | 0.495 |
| 97.8318117977528 | 0.2 | 0.2 | -0.314 | 0.495 |
| 97.99859550561798 | 0.191 | 0.2 | -0.305 | 0.486 |
| 98.16537921348316 | 0.171 | 0.21 | -0.305 | 0.476 |
| 98.33216292134833 | 0.162 | 0.238 | -0.295 | 0.476 |
| 98.49894662921349 | 0.162 | 0.286 | -0.286 | 0.486 |
| 98.66573033707866 | 0.162 | 0.324 | -0.286 | 0.524 |
| 98.8325140449438 | 0.162 | 0.362 | -0.286 | 0.553 |
| 98.99929775280897 | 0.162 | 0.391 | -0.286 | 0.562 |
| 99.16608146067416 | 0.162 | 0.381 | -0.286 | 0.553 |
| 99.33286516853933 | 0.162 | 0.381 | -0.286 | 0.553 |
| 99.49964887640449 | 0.152 | 0.372 | -0.286 | 0.543 |
| 99.66643258426966 | 0.143 | 0.372 | -0.286 | 0.534 |
| 99.83321629213484 | 0.143 | 0.333 | -0.276 | 0.514 |
| 100.0 | 0.143 | 0.305 | -0.267 | 0.476 |